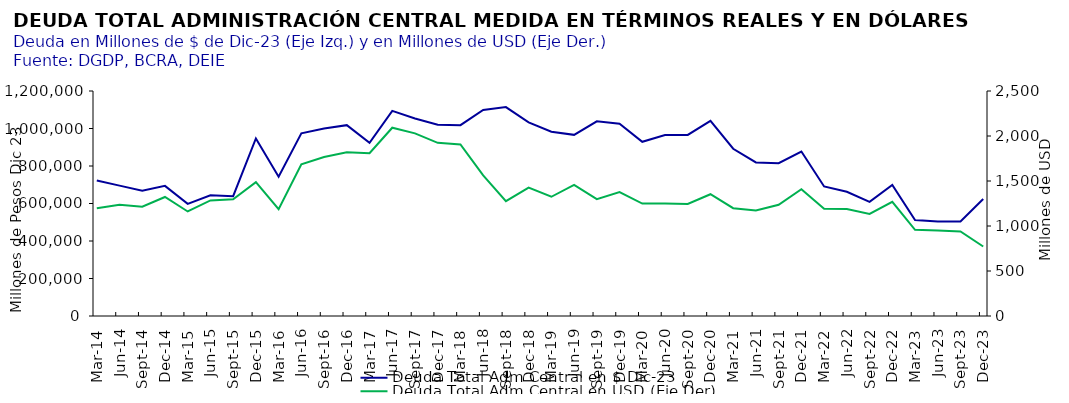
| Category | Deuda Total Adm Central en $ Dic-23 |
|---|---|
| 2014-03-31 | 722446.377 |
| 2014-06-30 | 695429.898 |
| 2014-09-30 | 668029.254 |
| 2014-12-31 | 694145.866 |
| 2015-03-31 | 598309.398 |
| 2015-06-30 | 643364.524 |
| 2015-09-30 | 638741.732 |
| 2015-12-31 | 946655.588 |
| 2016-03-31 | 743077.367 |
| 2016-06-30 | 974262.612 |
| 2016-09-30 | 1000144.216 |
| 2016-12-31 | 1017817.934 |
| 2017-03-31 | 923540.846 |
| 2017-06-30 | 1094010.438 |
| 2017-09-30 | 1053747.01 |
| 2017-12-31 | 1020581.98 |
| 2018-03-31 | 1017783.079 |
| 2018-06-30 | 1098476.714 |
| 2018-09-30 | 1114098.318 |
| 2018-12-31 | 1032949.375 |
| 2019-03-31 | 983015.067 |
| 2019-06-30 | 966196.379 |
| 2019-09-30 | 1038201.943 |
| 2019-12-31 | 1025657.382 |
| 2020-03-31 | 929112.626 |
| 2020-06-30 | 965092.094 |
| 2020-09-30 | 965924.255 |
| 2020-12-31 | 1040486.654 |
| 2021-03-31 | 891974.866 |
| 2021-06-30 | 819149.755 |
| 2021-09-30 | 814644.052 |
| 2021-12-31 | 877175.62 |
| 2022-03-31 | 690741.266 |
| 2022-06-30 | 662352.109 |
| 2022-09-30 | 608875.681 |
| 2022-12-31 | 699161.938 |
| 2023-03-31 | 511802.365 |
| 2023-06-30 | 503674.142 |
| 2023-09-30 | 504188.93 |
| 2023-12-31 | 624321.199 |